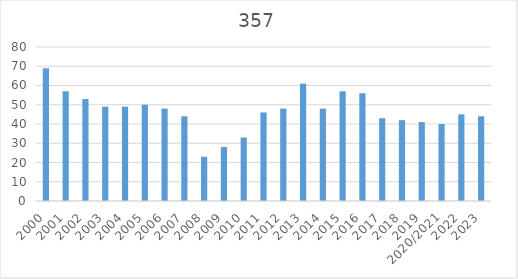
| Category | 357 |
|---|---|
| 2000 | 69 |
| 2001 | 57 |
| 2002 | 53 |
| 2003 | 49 |
| 2004 | 49 |
| 2005 | 50 |
| 2006 | 48 |
| 2007 | 44 |
| 2008 | 23 |
| 2009 | 28 |
| 2010 | 33 |
| 2011 | 46 |
| 2012 | 48 |
| 2013 | 61 |
| 2014 | 48 |
| 2015 | 57 |
| 2016 | 56 |
| 2017 | 43 |
| 2018 | 42 |
| 2019 | 41 |
| 2020/2021 | 40 |
| 2022 | 45 |
| 2023 | 44 |